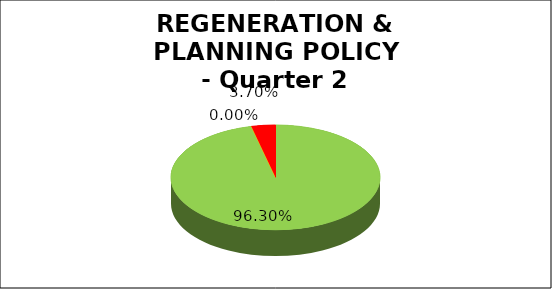
| Category | Q2 |
|---|---|
| Green | 0.963 |
| Amber | 0 |
| Red | 0.037 |